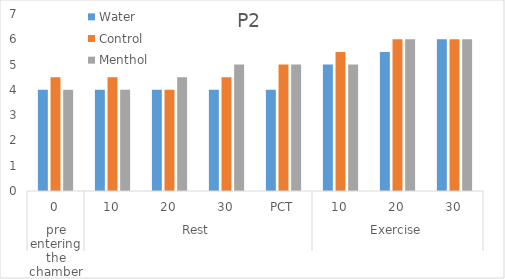
| Category | Water | Control | Menthol  |
|---|---|---|---|
| 0 | 4 | 4.5 | 4 |
| 1 | 4 | 4.5 | 4 |
| 2 | 4 | 4 | 4.5 |
| 3 | 4 | 4.5 | 5 |
| 4 | 4 | 5 | 5 |
| 5 | 5 | 5.5 | 5 |
| 6 | 5.5 | 6 | 6 |
| 7 | 6 | 6 | 6 |